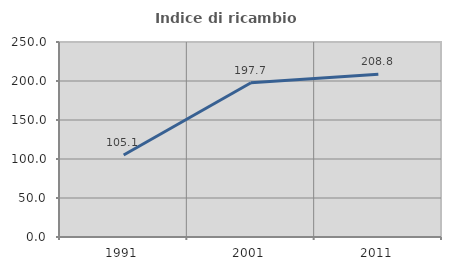
| Category | Indice di ricambio occupazionale  |
|---|---|
| 1991.0 | 105.072 |
| 2001.0 | 197.727 |
| 2011.0 | 208.784 |